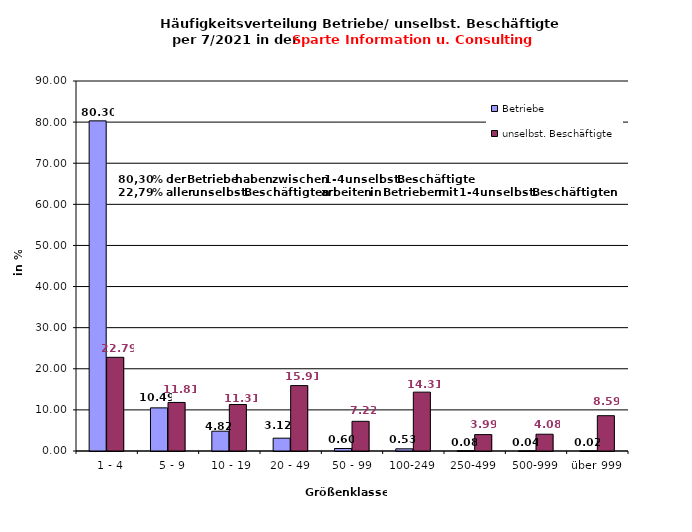
| Category | Betriebe | unselbst. Beschäftigte |
|---|---|---|
|   1 - 4 | 80.302 | 22.787 |
|   5 - 9 | 10.491 | 11.811 |
|  10 - 19 | 4.82 | 11.309 |
| 20 - 49 | 3.119 | 15.906 |
| 50 - 99 | 0.605 | 7.22 |
| 100-249 | 0.529 | 14.314 |
| 250-499 | 0.076 | 3.989 |
| 500-999 | 0.038 | 4.079 |
| über 999 | 0.019 | 8.586 |